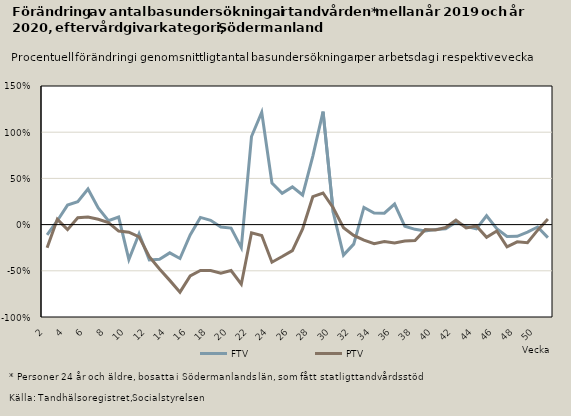
| Category | FTV | PTV |
|---|---|---|
| 2.0 | -0.111 | -0.25 |
| 3.0 | 0.042 | 0.057 |
| 4.0 | 0.211 | -0.055 |
| 5.0 | 0.247 | 0.074 |
| 6.0 | 0.385 | 0.083 |
| 7.0 | 0.18 | 0.058 |
| 8.0 | 0.043 | 0.022 |
| 9.0 | 0.082 | -0.07 |
| 10.0 | -0.379 | -0.082 |
| 11.0 | -0.1 | -0.133 |
| 12.0 | -0.383 | -0.346 |
| 13.0 | -0.375 | -0.48 |
| 14.0 | -0.306 | -0.604 |
| 15.0 | -0.367 | -0.731 |
| 16.0 | -0.112 | -0.555 |
| 17.0 | 0.078 | -0.496 |
| 18.0 | 0.047 | -0.496 |
| 19.0 | -0.025 | -0.526 |
| 20.0 | -0.038 | -0.497 |
| 21.0 | -0.249 | -0.645 |
| 22.0 | 0.953 | -0.089 |
| 23.0 | 1.216 | -0.119 |
| 24.0 | 0.451 | -0.407 |
| 25.0 | 0.338 | -0.346 |
| 26.0 | 0.408 | -0.281 |
| 27.0 | 0.32 | -0.047 |
| 28.0 | 0.742 | 0.302 |
| 29.0 | 1.223 | 0.342 |
| 30.0 | 0.13 | 0.18 |
| 31.0 | -0.33 | -0.033 |
| 32.0 | -0.211 | -0.116 |
| 33.0 | 0.186 | -0.169 |
| 34.0 | 0.126 | -0.206 |
| 35.0 | 0.123 | -0.183 |
| 36.0 | 0.223 | -0.198 |
| 37.0 | -0.018 | -0.177 |
| 38.0 | -0.051 | -0.172 |
| 39.0 | -0.068 | -0.054 |
| 40.0 | -0.053 | -0.059 |
| 41.0 | -0.046 | -0.032 |
| 42.0 | 0.026 | 0.047 |
| 43.0 | -0.019 | -0.036 |
| 44.0 | -0.046 | -0.015 |
| 45.0 | 0.095 | -0.138 |
| 46.0 | -0.044 | -0.069 |
| 47.0 | -0.128 | -0.24 |
| 48.0 | -0.127 | -0.187 |
| 49.0 | -0.08 | -0.196 |
| 50.0 | -0.026 | -0.06 |
| 51.0 | -0.141 | 0.06 |